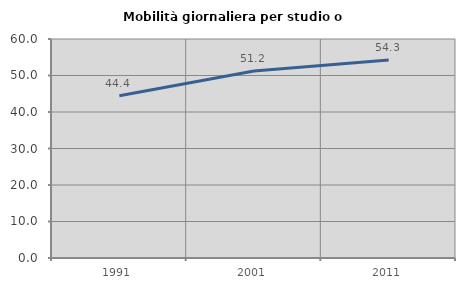
| Category | Mobilità giornaliera per studio o lavoro |
|---|---|
| 1991.0 | 44.428 |
| 2001.0 | 51.243 |
| 2011.0 | 54.25 |